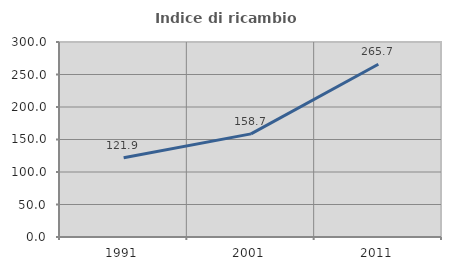
| Category | Indice di ricambio occupazionale  |
|---|---|
| 1991.0 | 121.872 |
| 2001.0 | 158.658 |
| 2011.0 | 265.693 |